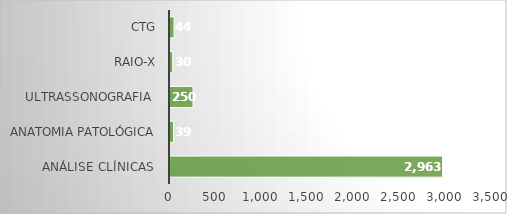
| Category | Series 0 |
|---|---|
| Análise Clínicas  | 2963 |
| Anatomia Patológica | 39 |
| Ultrassonografia  | 250 |
| RAIO-X | 30 |
| CTG | 44 |